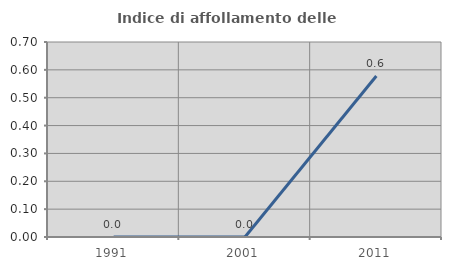
| Category | Indice di affollamento delle abitazioni  |
|---|---|
| 1991.0 | 0 |
| 2001.0 | 0 |
| 2011.0 | 0.578 |